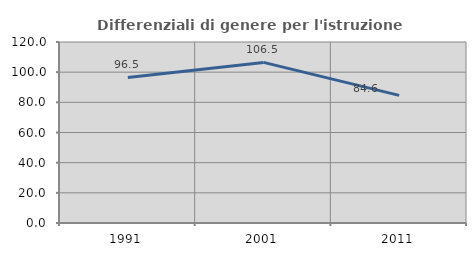
| Category | Differenziali di genere per l'istruzione superiore |
|---|---|
| 1991.0 | 96.523 |
| 2001.0 | 106.48 |
| 2011.0 | 84.621 |